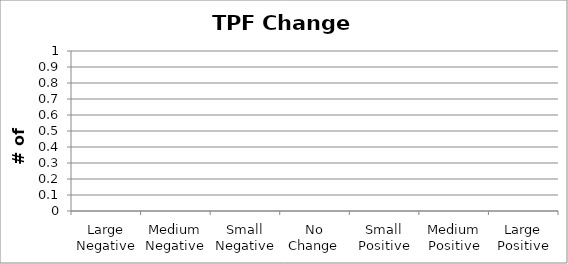
| Category | Series 0 |
|---|---|
| Large Negative | 0 |
| Medium Negative | 0 |
| Small Negative | 0 |
| No Change | 0 |
| Small Positive | 0 |
| Medium Positive | 0 |
| Large Positive | 0 |